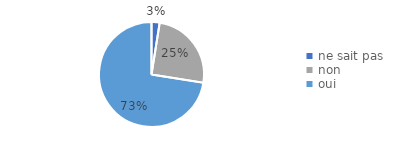
| Category | % |
|---|---|
| ne sait pas | 0.025 |
| non | 0.25 |
| oui | 0.725 |